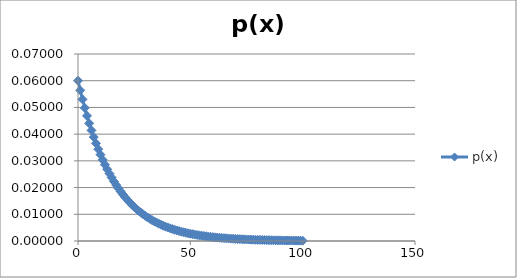
| Category | p(x) |
|---|---|
| 0.0 | 0.06 |
| 1.0 | 0.056 |
| 2.0 | 0.053 |
| 3.0 | 0.05 |
| 4.0 | 0.047 |
| 5.0 | 0.044 |
| 6.0 | 0.041 |
| 7.0 | 0.039 |
| 8.0 | 0.037 |
| 9.0 | 0.034 |
| 10.0 | 0.032 |
| 11.0 | 0.03 |
| 12.0 | 0.029 |
| 13.0 | 0.027 |
| 14.0 | 0.025 |
| 15.0 | 0.024 |
| 16.0 | 0.022 |
| 17.0 | 0.021 |
| 18.0 | 0.02 |
| 19.0 | 0.019 |
| 20.0 | 0.017 |
| 21.0 | 0.016 |
| 22.0 | 0.015 |
| 23.0 | 0.014 |
| 24.0 | 0.014 |
| 25.0 | 0.013 |
| 26.0 | 0.012 |
| 27.0 | 0.011 |
| 28.0 | 0.011 |
| 29.0 | 0.01 |
| 30.0 | 0.009 |
| 31.0 | 0.009 |
| 32.0 | 0.008 |
| 33.0 | 0.008 |
| 34.0 | 0.007 |
| 35.0 | 0.007 |
| 36.0 | 0.006 |
| 37.0 | 0.006 |
| 38.0 | 0.006 |
| 39.0 | 0.005 |
| 40.0 | 0.005 |
| 41.0 | 0.005 |
| 42.0 | 0.004 |
| 43.0 | 0.004 |
| 44.0 | 0.004 |
| 45.0 | 0.004 |
| 46.0 | 0.003 |
| 47.0 | 0.003 |
| 48.0 | 0.003 |
| 49.0 | 0.003 |
| 50.0 | 0.003 |
| 51.0 | 0.003 |
| 52.0 | 0.002 |
| 53.0 | 0.002 |
| 54.0 | 0.002 |
| 55.0 | 0.002 |
| 56.0 | 0.002 |
| 57.0 | 0.002 |
| 58.0 | 0.002 |
| 59.0 | 0.002 |
| 60.0 | 0.001 |
| 61.0 | 0.001 |
| 62.0 | 0.001 |
| 63.0 | 0.001 |
| 64.0 | 0.001 |
| 65.0 | 0.001 |
| 66.0 | 0.001 |
| 67.0 | 0.001 |
| 68.0 | 0.001 |
| 69.0 | 0.001 |
| 70.0 | 0.001 |
| 71.0 | 0.001 |
| 72.0 | 0.001 |
| 73.0 | 0.001 |
| 74.0 | 0.001 |
| 75.0 | 0.001 |
| 76.0 | 0.001 |
| 77.0 | 0.001 |
| 78.0 | 0 |
| 79.0 | 0 |
| 80.0 | 0 |
| 81.0 | 0 |
| 82.0 | 0 |
| 83.0 | 0 |
| 84.0 | 0 |
| 85.0 | 0 |
| 86.0 | 0 |
| 87.0 | 0 |
| 88.0 | 0 |
| 89.0 | 0 |
| 90.0 | 0 |
| 91.0 | 0 |
| 92.0 | 0 |
| 93.0 | 0 |
| 94.0 | 0 |
| 95.0 | 0 |
| 96.0 | 0 |
| 97.0 | 0 |
| 98.0 | 0 |
| 99.0 | 0 |
| 100.0 | 0 |